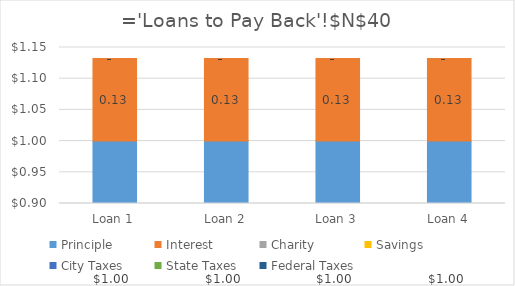
| Category | Principle | Interest | Charity | Savings | City Taxes | State Taxes | Federal Taxes |
|---|---|---|---|---|---|---|---|
| Loan 1 | 1 | 0.132 | 0 | 0 | 0 | 0 | 0 |
| Loan 2 | 1 | 0.132 | 0 | 0 | 0 | 0 | 0 |
| Loan 3 | 1 | 0.132 | 0 | 0 | 0 | 0 | 0 |
| Loan 4 | 1 | 0.132 | 0 | 0 | 0 | 0 | 0 |